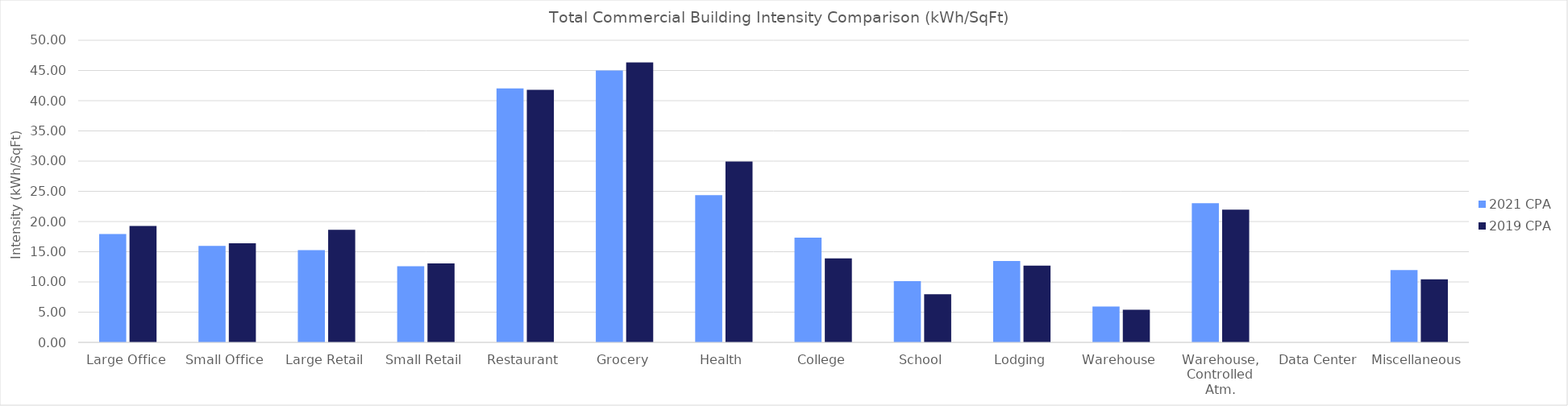
| Category | 2021 CPA | 2019 CPA |
|---|---|---|
| Large Office | 17.934 | 19.273 |
| Small Office | 15.973 | 16.407 |
| Large Retail | 15.25 | 18.642 |
| Small Retail | 12.592 | 13.074 |
| Restaurant | 42.025 | 41.802 |
| Grocery | 44.998 | 46.347 |
| Health | 24.363 | 29.949 |
| College | 17.337 | 13.914 |
| School | 10.139 | 7.962 |
| Lodging | 13.478 | 12.688 |
| Warehouse | 5.932 | 5.397 |
| Warehouse, Controlled Atm. | 23.039 | 21.972 |
| Data Center | 0 | 0 |
| Miscellaneous | 11.97 | 10.433 |